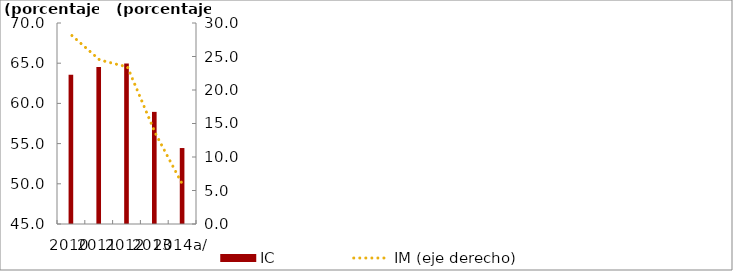
| Category | IC |
|---|---|
| 2010 | 63.57 |
| 2011 | 64.523 |
| 2012 | 64.959 |
| 2013 | 58.946 |
| 2014a/ | 54.449 |